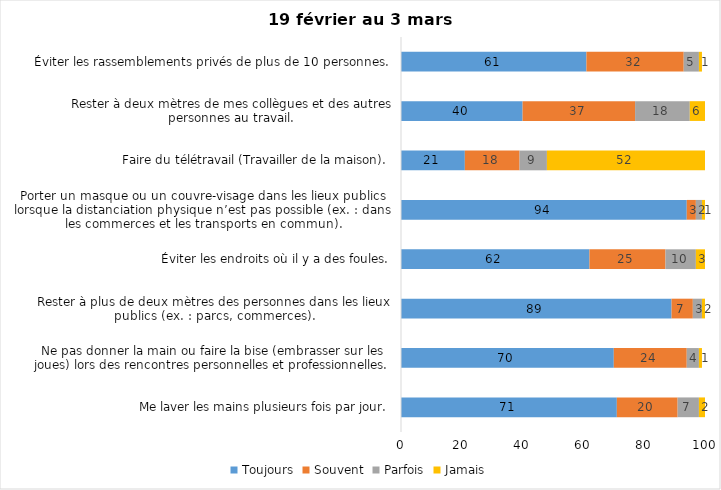
| Category | Toujours | Souvent | Parfois | Jamais |
|---|---|---|---|---|
| Me laver les mains plusieurs fois par jour. | 71 | 20 | 7 | 2 |
| Ne pas donner la main ou faire la bise (embrasser sur les joues) lors des rencontres personnelles et professionnelles. | 70 | 24 | 4 | 1 |
| Rester à plus de deux mètres des personnes dans les lieux publics (ex. : parcs, commerces). | 89 | 7 | 3 | 2 |
| Éviter les endroits où il y a des foules. | 62 | 25 | 10 | 3 |
| Porter un masque ou un couvre-visage dans les lieux publics lorsque la distanciation physique n’est pas possible (ex. : dans les commerces et les transports en commun). | 94 | 3 | 2 | 1 |
| Faire du télétravail (Travailler de la maison). | 21 | 18 | 9 | 52 |
| Rester à deux mètres de mes collègues et des autres personnes au travail. | 40 | 37 | 18 | 6 |
| Éviter les rassemblements privés de plus de 10 personnes. | 61 | 32 | 5 | 1 |